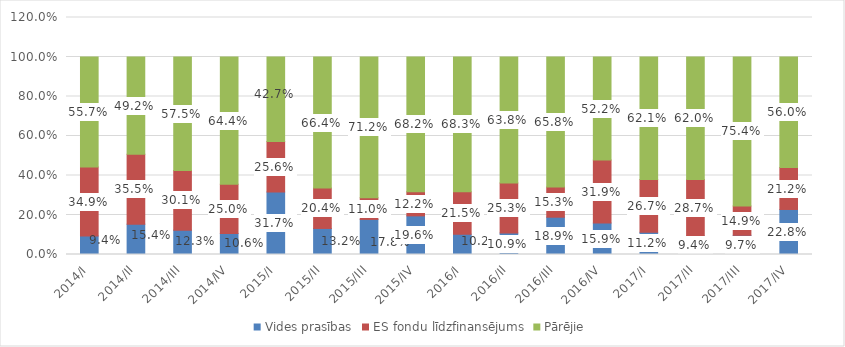
| Category | Vides prasības | ES fondu līdzfinansējums | Pārējie |
|---|---|---|---|
| 2014/I | 0.094 | 0.349 | 0.557 |
| 2014/II | 0.154 | 0.355 | 0.492 |
| 2014/III | 0.123 | 0.301 | 0.575 |
| 2014/IV | 0.106 | 0.25 | 0.644 |
| 2015/I | 0.317 | 0.256 | 0.427 |
| 2015/II | 0.132 | 0.204 | 0.664 |
| 2015/III | 0.178 | 0.11 | 0.712 |
| 2015/IV | 0.196 | 0.122 | 0.682 |
| 2016/I | 0.102 | 0.215 | 0.683 |
| 2016/II | 0.109 | 0.253 | 0.638 |
| 2016/III | 0.189 | 0.153 | 0.658 |
| 2016/IV | 0.159 | 0.319 | 0.522 |
| 2017/I | 0.112 | 0.267 | 0.621 |
| 2017/II | 0.094 | 0.287 | 0.62 |
| 2017/III | 0.097 | 0.149 | 0.754 |
| 2017/IV | 0.228 | 0.212 | 0.56 |